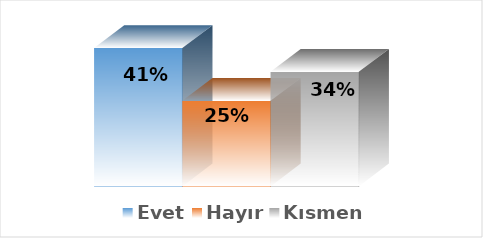
| Category | Evet | Hayır | Kısmen |
|---|---|---|---|
| 0 | 0.412 | 0.255 | 0.341 |